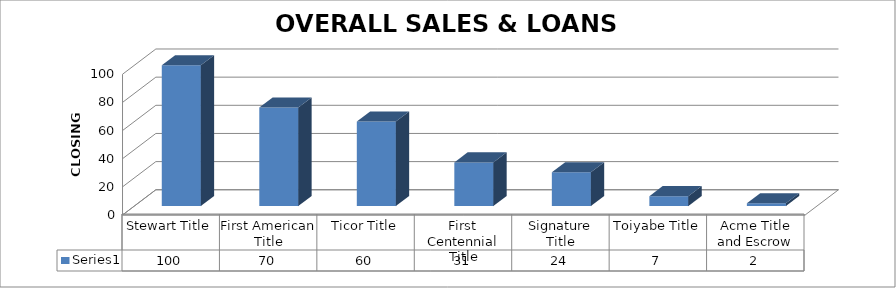
| Category | Series 0 |
|---|---|
| Stewart Title | 100 |
| First American Title | 70 |
| Ticor Title | 60 |
| First Centennial Title | 31 |
| Signature Title | 24 |
| Toiyabe Title | 7 |
| Acme Title and Escrow | 2 |